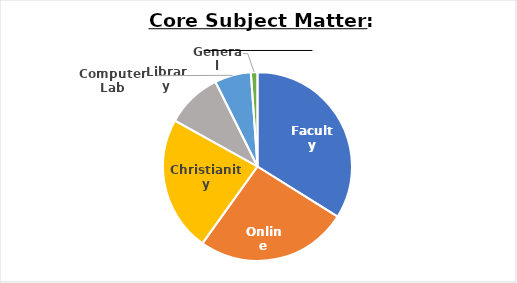
| Category | Count of Core Subject Matter |
|---|---|
| Faculty | 60 |
| Online | 46 |
| Christianity | 41 |
| Library | 17 |
| Computer Lab | 11 |
| General | 2 |